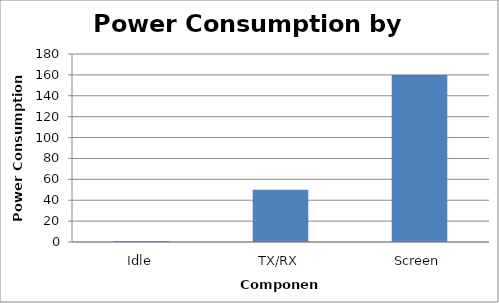
| Category | Power Consumption (mA) |
|---|---|
| Idle | 1 |
| TX/RX | 50 |
| Screen | 160 |